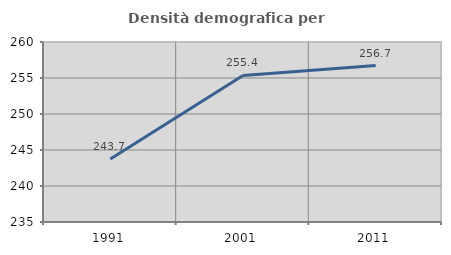
| Category | Densità demografica |
|---|---|
| 1991.0 | 243.748 |
| 2001.0 | 255.352 |
| 2011.0 | 256.725 |